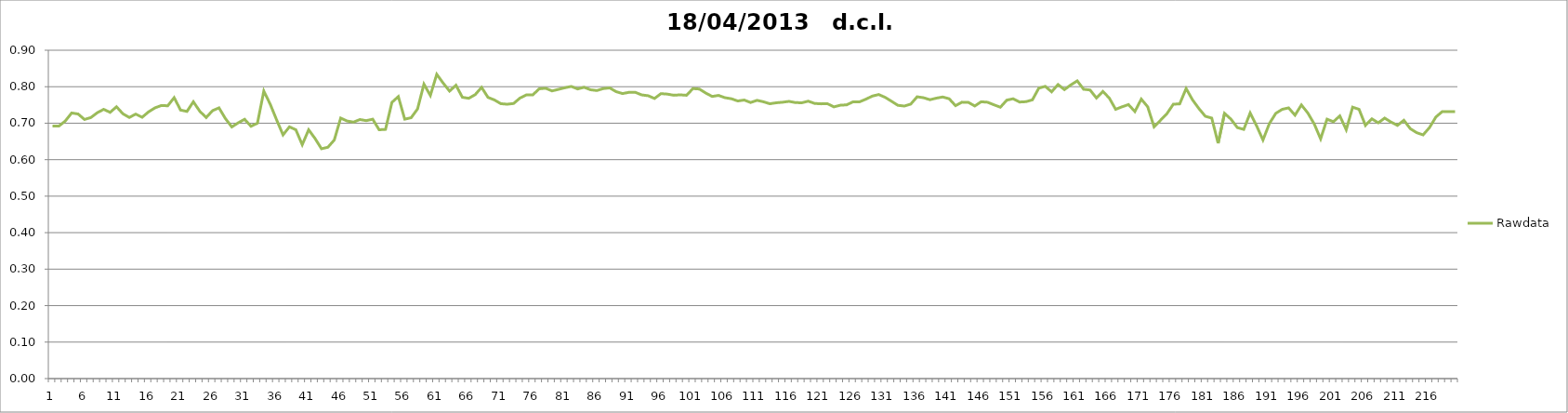
| Category | Rawdata |
|---|---|
| 0 | 0.692 |
| 1 | 0.692 |
| 2 | 0.706 |
| 3 | 0.728 |
| 4 | 0.725 |
| 5 | 0.71 |
| 6 | 0.716 |
| 7 | 0.729 |
| 8 | 0.738 |
| 9 | 0.73 |
| 10 | 0.745 |
| 11 | 0.726 |
| 12 | 0.716 |
| 13 | 0.725 |
| 14 | 0.716 |
| 15 | 0.731 |
| 16 | 0.742 |
| 17 | 0.749 |
| 18 | 0.748 |
| 19 | 0.77 |
| 20 | 0.736 |
| 21 | 0.732 |
| 22 | 0.759 |
| 23 | 0.733 |
| 24 | 0.716 |
| 25 | 0.735 |
| 26 | 0.742 |
| 27 | 0.713 |
| 28 | 0.69 |
| 29 | 0.701 |
| 30 | 0.711 |
| 31 | 0.692 |
| 32 | 0.7 |
| 33 | 0.788 |
| 34 | 0.752 |
| 35 | 0.709 |
| 36 | 0.668 |
| 37 | 0.69 |
| 38 | 0.682 |
| 39 | 0.641 |
| 40 | 0.682 |
| 41 | 0.658 |
| 42 | 0.63 |
| 43 | 0.634 |
| 44 | 0.654 |
| 45 | 0.714 |
| 46 | 0.706 |
| 47 | 0.703 |
| 48 | 0.71 |
| 49 | 0.707 |
| 50 | 0.711 |
| 51 | 0.682 |
| 52 | 0.683 |
| 53 | 0.757 |
| 54 | 0.773 |
| 55 | 0.711 |
| 56 | 0.715 |
| 57 | 0.739 |
| 58 | 0.807 |
| 59 | 0.776 |
| 60 | 0.834 |
| 61 | 0.81 |
| 62 | 0.788 |
| 63 | 0.804 |
| 64 | 0.771 |
| 65 | 0.768 |
| 66 | 0.778 |
| 67 | 0.798 |
| 68 | 0.771 |
| 69 | 0.764 |
| 70 | 0.754 |
| 71 | 0.752 |
| 72 | 0.754 |
| 73 | 0.769 |
| 74 | 0.778 |
| 75 | 0.778 |
| 76 | 0.794 |
| 77 | 0.796 |
| 78 | 0.789 |
| 79 | 0.793 |
| 80 | 0.797 |
| 81 | 0.801 |
| 82 | 0.794 |
| 83 | 0.798 |
| 84 | 0.792 |
| 85 | 0.79 |
| 86 | 0.795 |
| 87 | 0.797 |
| 88 | 0.787 |
| 89 | 0.781 |
| 90 | 0.784 |
| 91 | 0.785 |
| 92 | 0.778 |
| 93 | 0.775 |
| 94 | 0.768 |
| 95 | 0.781 |
| 96 | 0.78 |
| 97 | 0.777 |
| 98 | 0.778 |
| 99 | 0.776 |
| 100 | 0.795 |
| 101 | 0.794 |
| 102 | 0.783 |
| 103 | 0.773 |
| 104 | 0.776 |
| 105 | 0.77 |
| 106 | 0.767 |
| 107 | 0.761 |
| 108 | 0.764 |
| 109 | 0.757 |
| 110 | 0.763 |
| 111 | 0.759 |
| 112 | 0.753 |
| 113 | 0.756 |
| 114 | 0.758 |
| 115 | 0.76 |
| 116 | 0.757 |
| 117 | 0.756 |
| 118 | 0.76 |
| 119 | 0.754 |
| 120 | 0.753 |
| 121 | 0.753 |
| 122 | 0.745 |
| 123 | 0.749 |
| 124 | 0.75 |
| 125 | 0.759 |
| 126 | 0.759 |
| 127 | 0.766 |
| 128 | 0.774 |
| 129 | 0.779 |
| 130 | 0.771 |
| 131 | 0.76 |
| 132 | 0.749 |
| 133 | 0.747 |
| 134 | 0.752 |
| 135 | 0.772 |
| 136 | 0.77 |
| 137 | 0.764 |
| 138 | 0.769 |
| 139 | 0.772 |
| 140 | 0.767 |
| 141 | 0.748 |
| 142 | 0.758 |
| 143 | 0.757 |
| 144 | 0.747 |
| 145 | 0.759 |
| 146 | 0.757 |
| 147 | 0.75 |
| 148 | 0.744 |
| 149 | 0.763 |
| 150 | 0.767 |
| 151 | 0.758 |
| 152 | 0.759 |
| 153 | 0.764 |
| 154 | 0.796 |
| 155 | 0.801 |
| 156 | 0.786 |
| 157 | 0.806 |
| 158 | 0.792 |
| 159 | 0.805 |
| 160 | 0.816 |
| 161 | 0.793 |
| 162 | 0.791 |
| 163 | 0.769 |
| 164 | 0.787 |
| 165 | 0.769 |
| 166 | 0.738 |
| 167 | 0.745 |
| 168 | 0.751 |
| 169 | 0.732 |
| 170 | 0.766 |
| 171 | 0.745 |
| 172 | 0.69 |
| 173 | 0.708 |
| 174 | 0.726 |
| 175 | 0.752 |
| 176 | 0.753 |
| 177 | 0.795 |
| 178 | 0.764 |
| 179 | 0.74 |
| 180 | 0.719 |
| 181 | 0.714 |
| 182 | 0.645 |
| 183 | 0.727 |
| 184 | 0.711 |
| 185 | 0.688 |
| 186 | 0.683 |
| 187 | 0.728 |
| 188 | 0.693 |
| 189 | 0.654 |
| 190 | 0.699 |
| 191 | 0.727 |
| 192 | 0.738 |
| 193 | 0.742 |
| 194 | 0.722 |
| 195 | 0.75 |
| 196 | 0.728 |
| 197 | 0.698 |
| 198 | 0.657 |
| 199 | 0.711 |
| 200 | 0.704 |
| 201 | 0.72 |
| 202 | 0.682 |
| 203 | 0.744 |
| 204 | 0.738 |
| 205 | 0.694 |
| 206 | 0.712 |
| 207 | 0.701 |
| 208 | 0.714 |
| 209 | 0.703 |
| 210 | 0.694 |
| 211 | 0.708 |
| 212 | 0.685 |
| 213 | 0.674 |
| 214 | 0.668 |
| 215 | 0.688 |
| 216 | 0.717 |
| 217 | 0.732 |
| 218 | 0.732 |
| 219 | 0.732 |